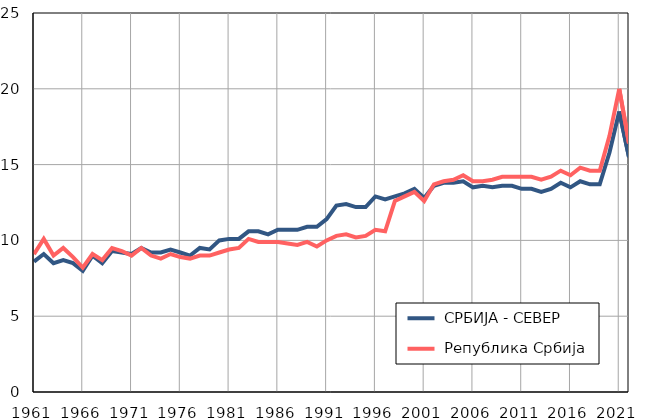
| Category |  СРБИЈА - СЕВЕР |  Република Србија |
|---|---|---|
| 1961.0 | 8.6 | 9.1 |
| 1962.0 | 9.1 | 10.1 |
| 1963.0 | 8.5 | 9 |
| 1964.0 | 8.7 | 9.5 |
| 1965.0 | 8.5 | 8.9 |
| 1966.0 | 8 | 8.2 |
| 1967.0 | 9 | 9.1 |
| 1968.0 | 8.5 | 8.7 |
| 1969.0 | 9.3 | 9.5 |
| 1970.0 | 9.2 | 9.3 |
| 1971.0 | 9.1 | 9 |
| 1972.0 | 9.5 | 9.5 |
| 1973.0 | 9.2 | 9 |
| 1974.0 | 9.2 | 8.8 |
| 1975.0 | 9.4 | 9.1 |
| 1976.0 | 9.2 | 8.9 |
| 1977.0 | 9 | 8.8 |
| 1978.0 | 9.5 | 9 |
| 1979.0 | 9.4 | 9 |
| 1980.0 | 10 | 9.2 |
| 1981.0 | 10.1 | 9.4 |
| 1982.0 | 10.1 | 9.5 |
| 1983.0 | 10.6 | 10.1 |
| 1984.0 | 10.6 | 9.9 |
| 1985.0 | 10.4 | 9.9 |
| 1986.0 | 10.7 | 9.9 |
| 1987.0 | 10.7 | 9.8 |
| 1988.0 | 10.7 | 9.7 |
| 1989.0 | 10.9 | 9.9 |
| 1990.0 | 10.9 | 9.6 |
| 1991.0 | 11.4 | 10 |
| 1992.0 | 12.3 | 10.3 |
| 1993.0 | 12.4 | 10.4 |
| 1994.0 | 12.2 | 10.2 |
| 1995.0 | 12.2 | 10.3 |
| 1996.0 | 12.9 | 10.7 |
| 1997.0 | 12.7 | 10.6 |
| 1998.0 | 12.9 | 12.6 |
| 1999.0 | 13.1 | 12.9 |
| 2000.0 | 13.4 | 13.2 |
| 2001.0 | 12.8 | 12.6 |
| 2002.0 | 13.6 | 13.7 |
| 2003.0 | 13.8 | 13.9 |
| 2004.0 | 13.8 | 14 |
| 2005.0 | 13.9 | 14.3 |
| 2006.0 | 13.5 | 13.9 |
| 2007.0 | 13.6 | 13.9 |
| 2008.0 | 13.5 | 14 |
| 2009.0 | 13.6 | 14.2 |
| 2010.0 | 13.6 | 14.2 |
| 2011.0 | 13.4 | 14.2 |
| 2012.0 | 13.4 | 14.2 |
| 2013.0 | 13.2 | 14 |
| 2014.0 | 13.4 | 14.2 |
| 2015.0 | 13.8 | 14.6 |
| 2016.0 | 13.5 | 14.3 |
| 2017.0 | 13.9 | 14.8 |
| 2018.0 | 13.7 | 14.6 |
| 2019.0 | 13.7 | 14.6 |
| 2020.0 | 15.8 | 16.9 |
| 2021.0 | 18.5 | 20 |
| 2022.0 | 15.5 | 16.4 |